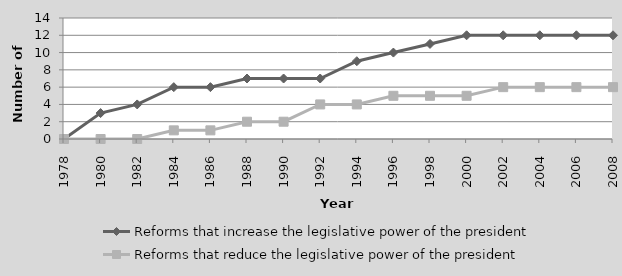
| Category | Reforms that increase the legislative power of the president | Reforms that reduce the legislative power of the president |
|---|---|---|
| 1978.0 | 0 | 0 |
| 1980.0 | 3 | 0 |
| 1982.0 | 4 | 0 |
| 1984.0 | 6 | 1 |
| 1986.0 | 6 | 1 |
| 1988.0 | 7 | 2 |
| 1990.0 | 7 | 2 |
| 1992.0 | 7 | 4 |
| 1994.0 | 9 | 4 |
| 1996.0 | 10 | 5 |
| 1998.0 | 11 | 5 |
| 2000.0 | 12 | 5 |
| 2002.0 | 12 | 6 |
| 2004.0 | 12 | 6 |
| 2006.0 | 12 | 6 |
| 2008.0 | 12 | 6 |